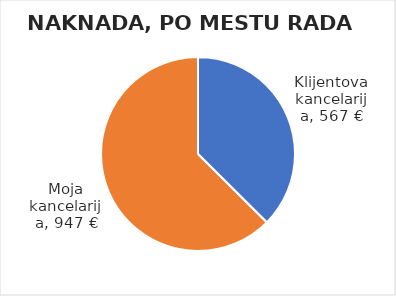
| Category | Ukupna naknada |
|---|---|
| Klijentova kancelarija | 567 |
| Moja kancelarija | 947 |